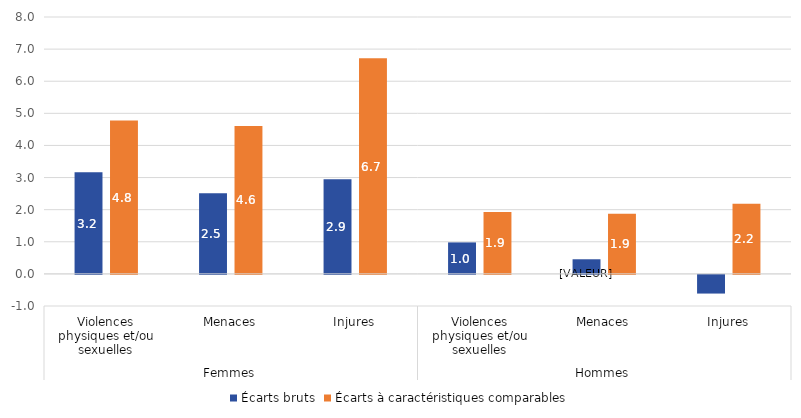
| Category | Écarts bruts | Écarts à caractéristiques comparables |
|---|---|---|
| 0 | 3.165 | 4.777 |
| 1 | 2.512 | 4.604 |
| 2 | 2.948 | 6.714 |
| 3 | 0.98 | 1.925 |
| 4 | 0.455 | 1.875 |
| 5 | -0.581 | 2.182 |